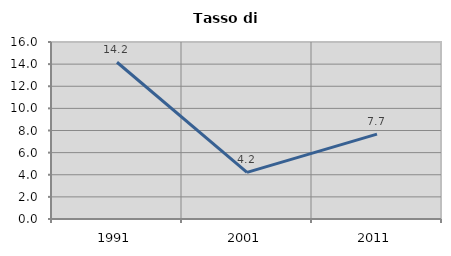
| Category | Tasso di disoccupazione   |
|---|---|
| 1991.0 | 14.168 |
| 2001.0 | 4.22 |
| 2011.0 | 7.677 |